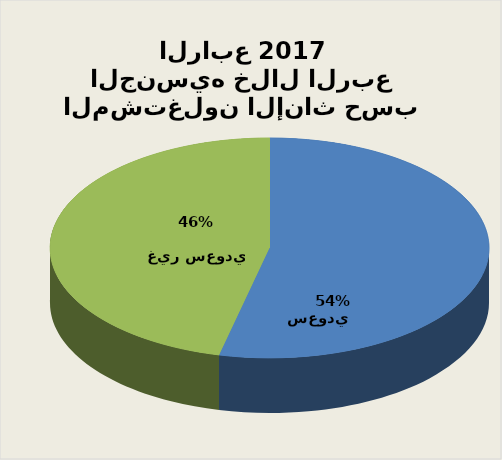
| Category | Series 0 |
|---|---|
| سعودي        | 154584 |
| غير سعودي         | 133358 |